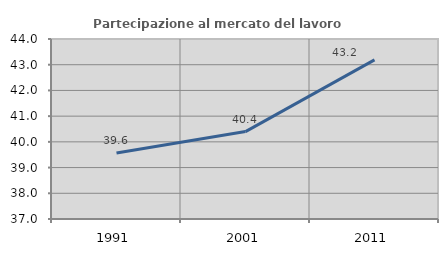
| Category | Partecipazione al mercato del lavoro  femminile |
|---|---|
| 1991.0 | 39.568 |
| 2001.0 | 40.399 |
| 2011.0 | 43.188 |